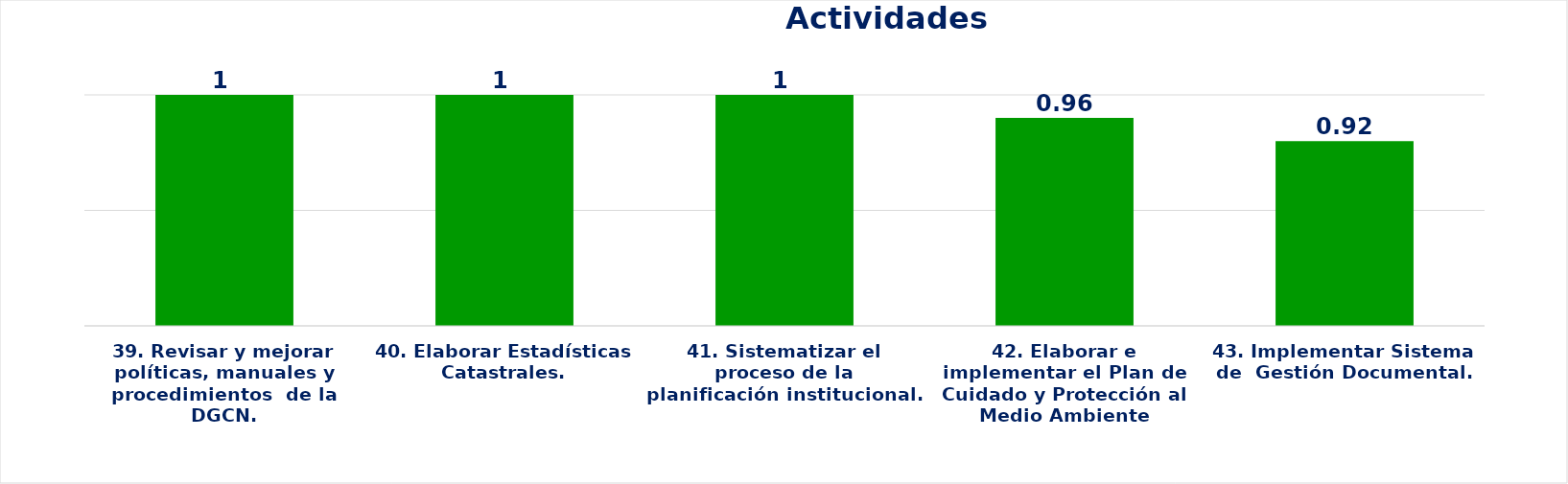
| Category | Series 0 |
|---|---|
| 39. Revisar y mejorar políticas, manuales y procedimientos  de la DGCN. | 1 |
| 40. Elaborar Estadísticas Catastrales. | 1 |
| 41. Sistematizar el proceso de la planificación institucional. | 1 |
| 42. Elaborar e implementar el Plan de Cuidado y Protección al Medio Ambiente | 0.96 |
| 43. Implementar Sistema de  Gestión Documental. | 0.92 |